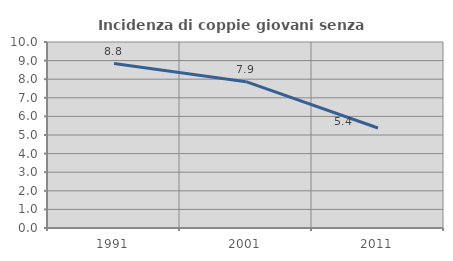
| Category | Incidenza di coppie giovani senza figli |
|---|---|
| 1991.0 | 8.839 |
| 2001.0 | 7.868 |
| 2011.0 | 5.376 |